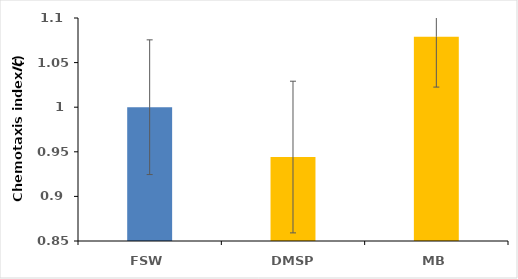
| Category | Series 0 |
|---|---|
| FSW | 1 |
| DMSP | 0.944 |
| MB | 1.079 |